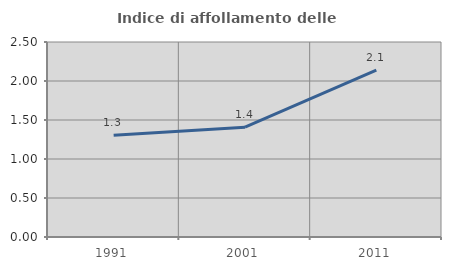
| Category | Indice di affollamento delle abitazioni  |
|---|---|
| 1991.0 | 1.305 |
| 2001.0 | 1.408 |
| 2011.0 | 2.141 |